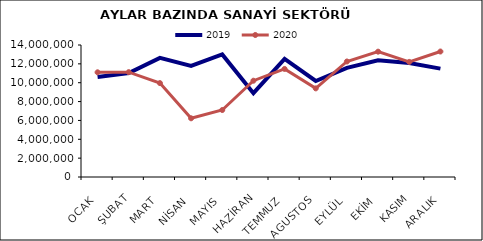
| Category | 2019 | 2020 |
|---|---|---|
| OCAK | 10611504.966 | 11103396.435 |
| ŞUBAT | 11030293.075 | 11120962.02 |
| MART | 12637591.699 | 9960004.038 |
| NİSAN | 11772670.415 | 6226323.073 |
| MAYIS | 12995685.753 | 7103788.612 |
| HAZİRAN | 8887879.287 | 10211842.786 |
| TEMMUZ | 12516166.16 | 11459739.617 |
| AGUSTOS | 10183262.956 | 9400264.918 |
| EYLÜL | 11581011.559 | 12251437.982 |
| EKİM | 12381696.967 | 13292713.153 |
| KASIM | 12094447.218 | 12206271.22 |
| ARALIK | 11497367.136 | 13308485.736 |